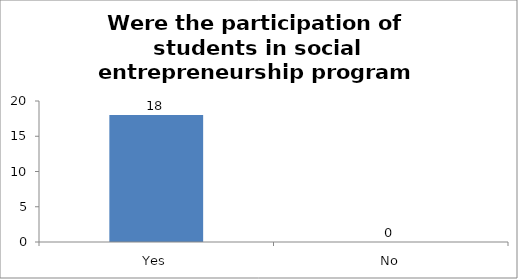
| Category | Were the participation of students in social entrepreneurship program appreciated by parents? |
|---|---|
| Yes | 18 |
| No | 0 |